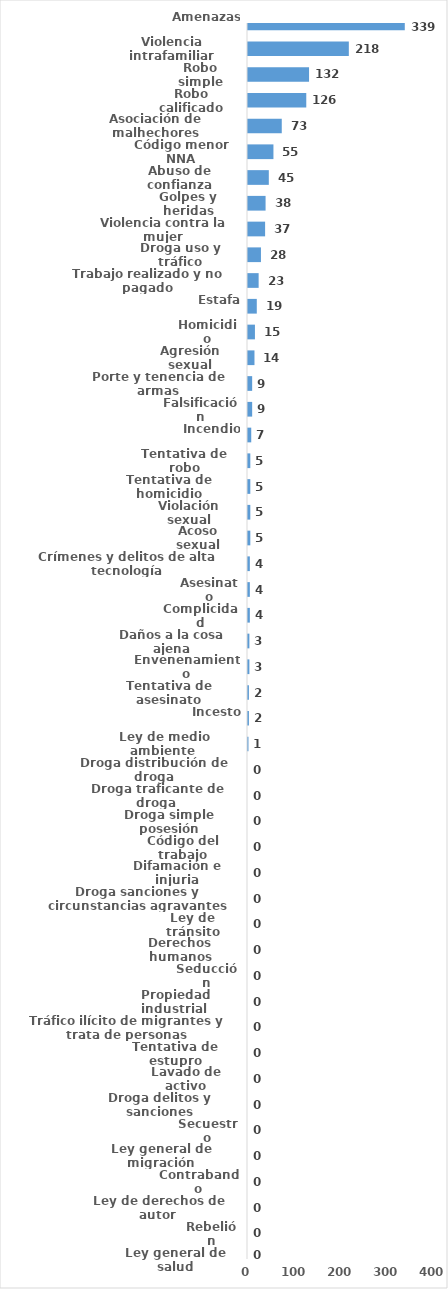
| Category | Series 0 |
|---|---|
| Amenazas | 339 |
| Violencia intrafamiliar | 218 |
| Robo simple | 132 |
| Robo calificado | 126 |
| Asociación de malhechores | 73 |
| Código menor NNA | 55 |
| Abuso de confianza | 45 |
| Golpes y heridas | 38 |
| Violencia contra la mujer | 37 |
| Droga uso y tráfico | 28 |
| Trabajo realizado y no pagado | 23 |
| Estafa | 19 |
| Homicidio | 15 |
| Agresión sexual | 14 |
| Porte y tenencia de armas | 9 |
| Falsificación | 9 |
| Incendio | 7 |
| Tentativa de robo | 5 |
| Tentativa de homicidio | 5 |
| Violación sexual | 5 |
| Acoso sexual | 5 |
| Crímenes y delitos de alta tecnología | 4 |
| Asesinato | 4 |
| Complicidad | 4 |
| Daños a la cosa ajena | 3 |
| Envenenamiento | 3 |
| Tentativa de asesinato | 2 |
| Incesto | 2 |
| Ley de medio ambiente  | 1 |
| Droga distribución de droga | 0 |
| Droga traficante de droga  | 0 |
| Droga simple posesión | 0 |
| Código del trabajo | 0 |
| Difamación e injuria | 0 |
| Droga sanciones y circunstancias agravantes | 0 |
| Ley de tránsito | 0 |
| Derechos humanos | 0 |
| Seducción | 0 |
| Propiedad industrial  | 0 |
| Tráfico ilícito de migrantes y trata de personas | 0 |
| Tentativa de estupro | 0 |
| Lavado de activo | 0 |
| Droga delitos y sanciones | 0 |
| Secuestro | 0 |
| Ley general de migración | 0 |
| Contrabando | 0 |
| Ley de derechos de autor  | 0 |
| Rebelión | 0 |
| Ley general de salud | 0 |